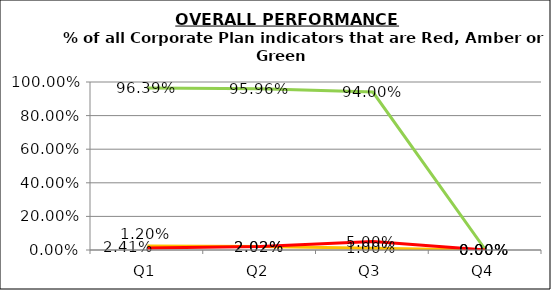
| Category | Green | Amber | Red |
|---|---|---|---|
| Q1 | 0.964 | 0.024 | 0.012 |
| Q2 | 0.96 | 0.02 | 0.02 |
| Q3 | 0.94 | 0.01 | 0.05 |
| Q4 | 0 | 0 | 0 |